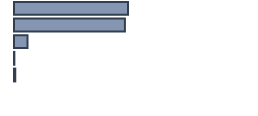
| Category | Percentatge |
|---|---|
| 0 | 47.5 |
| 1 | 46.212 |
| 2 | 5.606 |
| 3 | 0.152 |
| 4 | 0.53 |
| 5 | 0 |